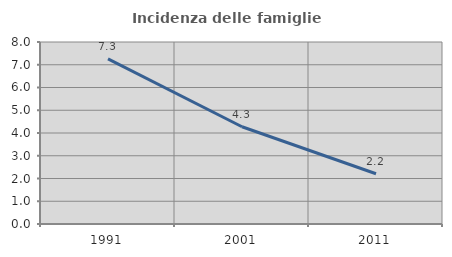
| Category | Incidenza delle famiglie numerose |
|---|---|
| 1991.0 | 7.26 |
| 2001.0 | 4.276 |
| 2011.0 | 2.21 |